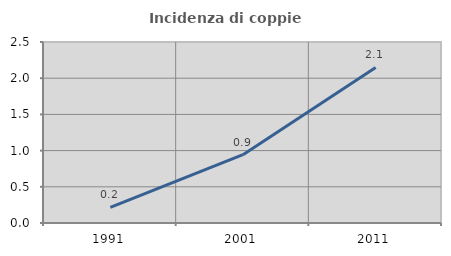
| Category | Incidenza di coppie miste |
|---|---|
| 1991.0 | 0.216 |
| 2001.0 | 0.944 |
| 2011.0 | 2.149 |